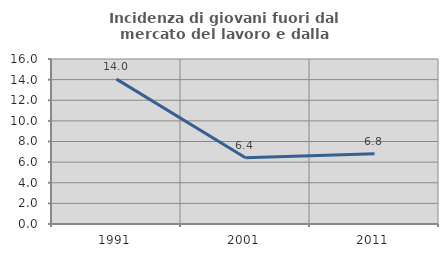
| Category | Incidenza di giovani fuori dal mercato del lavoro e dalla formazione  |
|---|---|
| 1991.0 | 14.05 |
| 2001.0 | 6.422 |
| 2011.0 | 6.818 |